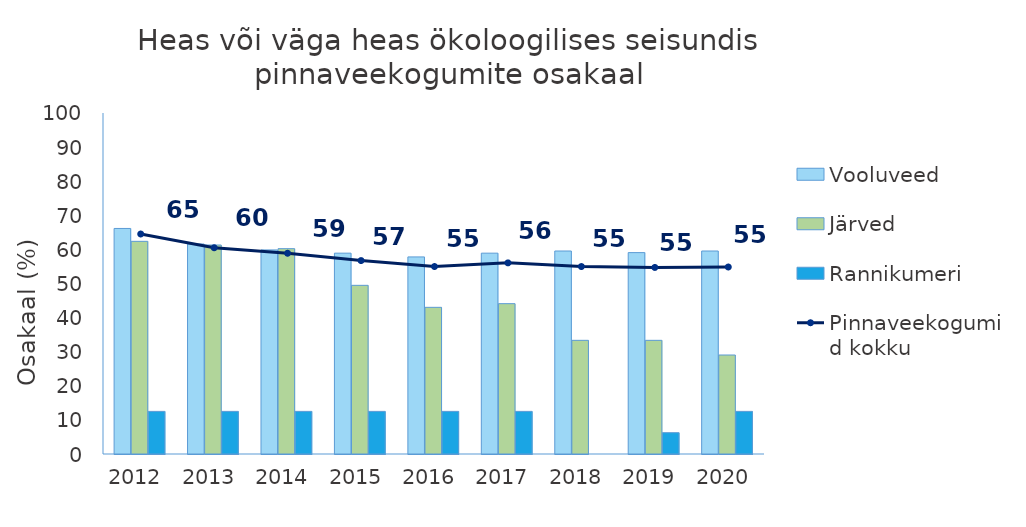
| Category | Vooluveed | Järved | Rannikumeri |
|---|---|---|---|
| 2012.0 | 66.142 | 62.366 | 12.5 |
| 2013.0 | 61.575 | 61.29 | 12.5 |
| 2014.0 | 59.843 | 60.215 | 12.5 |
| 2015.0 | 58.898 | 49.462 | 12.5 |
| 2016.0 | 57.795 | 43.011 | 12.5 |
| 2017.0 | 58.898 | 44.086 | 12.5 |
| 2018.0 | 59.528 | 33.333 | 0 |
| 2019.0 | 59.055 | 33.333 | 6.25 |
| 2020.0 | 59.528 | 29.032 | 12.5 |